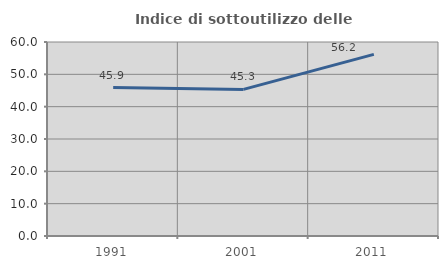
| Category | Indice di sottoutilizzo delle abitazioni  |
|---|---|
| 1991.0 | 45.909 |
| 2001.0 | 45.333 |
| 2011.0 | 56.164 |